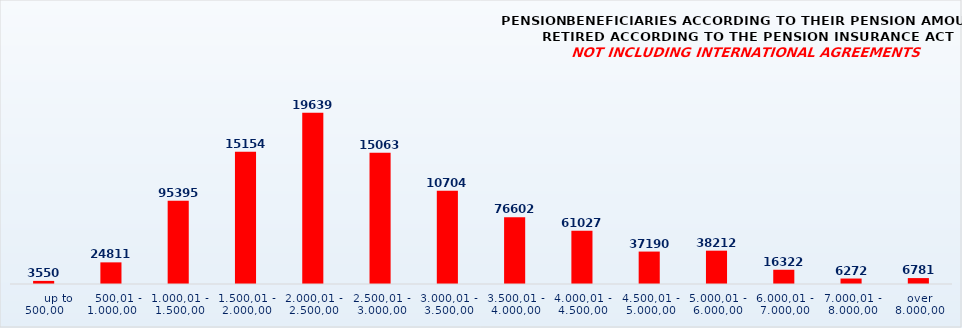
| Category | PENSION BENEFICIARIES ACCORDING TO TYPES AND AMOUNTS OF PENSION, RETIRED ACCORDING TO THE PENSION INSURANCE ACT
NOT INCLUDING INTERNATIONAL AGREEMENTS |
|---|---|
|       up to 500,00 | 3550 |
|    500,01 - 1.000,00 | 24811 |
| 1.000,01 - 1.500,00 | 95395 |
| 1.500,01 - 2.000,00 | 151541 |
| 2.000,01 - 2.500,00 | 196390 |
| 2.500,01 - 3.000,00 | 150630 |
| 3.000,01 - 3.500,00 | 107047 |
| 3.500,01 - 4.000,00 | 76602 |
| 4.000,01 - 4.500,00 | 61027 |
| 4.500,01 - 5.000,00 | 37190 |
| 5.000,01 - 6.000,00 | 38212 |
| 6.000,01 - 7.000,00 | 16322 |
| 7.000,01 - 8.000,00 | 6272 |
|  over  8.000,00 | 6781 |